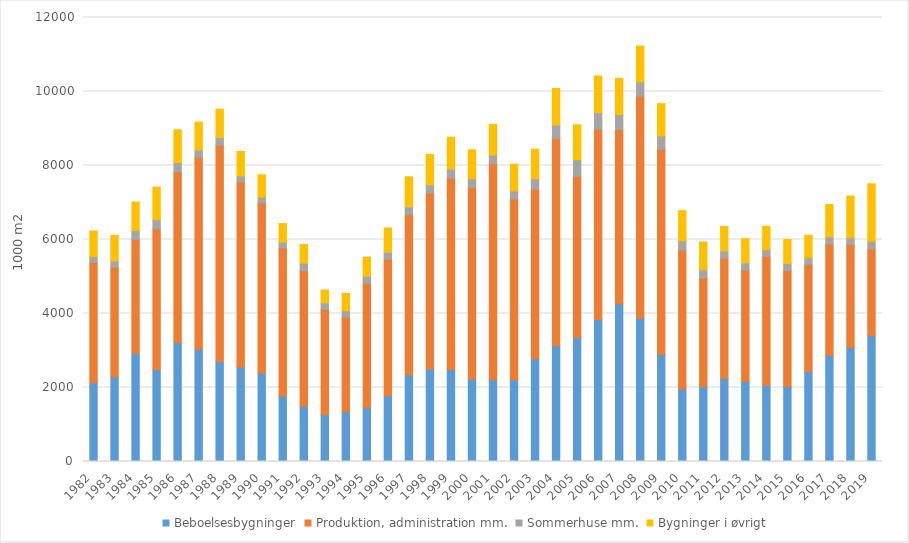
| Category | Beboelsesbygninger | Produktion, administration mm. | Sommerhuse mm. | Bygninger i øvrigt |
|---|---|---|---|---|
| 1982 | 2129.288 | 3254.617 | 156.497 | 689.438 |
| 1983 | 2286.894 | 2964.675 | 168.269 | 690.079 |
| 1984 | 2922.97 | 3073.718 | 247.712 | 768.984 |
| 1985 | 2483.391 | 3811.789 | 240.256 | 881.294 |
| 1986 | 3218.41 | 4605.788 | 250.771 | 891.343 |
| 1987 | 3031.841 | 5189.478 | 199.505 | 751.987 |
| 1988 | 2693.13 | 5852.876 | 206.254 | 770.067 |
| 1989 | 2545.884 | 5010.111 | 160.621 | 661.104 |
| 1990 | 2393.059 | 4591.995 | 160.306 | 603.764 |
| 1991 | 1772.942 | 3999.038 | 154.912 | 504.701 |
| 1992 | 1499.718 | 3655.22 | 207.339 | 505.573 |
| 1993 | 1262.697 | 2848.022 | 170.785 | 354.265 |
| 1994 | 1346.93 | 2556.095 | 171.508 | 469.464 |
| 1995 | 1451.569 | 3363.987 | 191.62 | 517.916 |
| 1996 | 1779.159 | 3685.792 | 194.465 | 652.891 |
| 1997 | 2340.488 | 4324.652 | 215.498 | 815.366 |
| 1998 | 2501.158 | 4757.061 | 218.728 | 817.867 |
| 1999 | 2488.661 | 5171.006 | 244.053 | 861.905 |
| 2000 | 2231.831 | 5176.503 | 229.935 | 788.008 |
| 2001 | 2211.015 | 5845.488 | 224.249 | 830.165 |
| 2002 | 2205.664 | 4887.298 | 221.092 | 719.25 |
| 2003 | 2774.798 | 4586.455 | 283.05 | 798.766 |
| 2004 | 3128.469 | 5602.336 | 361.658 | 989.631 |
| 2005 | 3354.452 | 4353.781 | 451.095 | 941.904 |
| 2006 | 3837.456 | 5145.919 | 447.004 | 990.26 |
| 2007 | 4265.481 | 4702.609 | 408.338 | 982.032 |
| 2008 | 3873.676 | 6003.321 | 383.666 | 967.964 |
| 2009 | 2900.259 | 5544.219 | 350.837 | 874.76 |
| 2010 | 1969.356 | 3746.151 | 249.915 | 815.26 |
| 2011 | 2018.615 | 2937.993 | 226.573 | 750.177 |
| 2012 | 2241.992 | 3254.874 | 194.747 | 660.388 |
| 2013 | 2161.294 | 3011.637 | 192.467 | 657.589 |
| 2014 | 2063.091 | 3482.554 | 180.16 | 631.068 |
| 2015 | 2027.875 | 3131.942 | 191.483 | 646.771 |
| 2016 | 2431 | 2903 | 171 | 611 |
| 2017 | 2867 | 3013 | 191 | 874 |
| 2018 | 3082 | 2789 | 176 | 1128 |
| 2019 | 3396 | 2355 | 199 | 1556 |